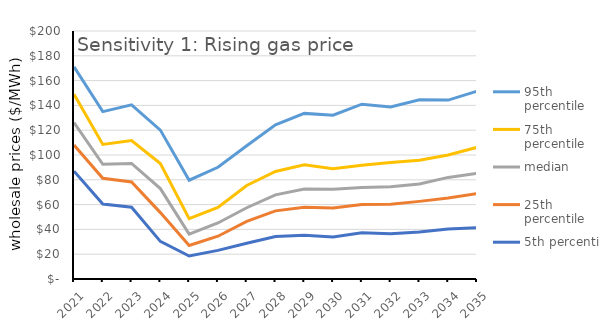
| Category | 95th percentile | 75th percentile | median | 25th percentile | 5th percentile |
|---|---|---|---|---|---|
| 2021.0 | 171.081 | 149.047 | 126.065 | 108.05 | 86.912 |
| 2022.0 | 134.95 | 108.49 | 92.52 | 81.262 | 60.397 |
| 2023.0 | 140.436 | 111.635 | 93.19 | 78.315 | 57.835 |
| 2024.0 | 120.075 | 93.102 | 72.895 | 53.545 | 30.322 |
| 2025.0 | 79.661 | 48.62 | 36.165 | 26.995 | 18.533 |
| 2026.0 | 90.066 | 57.795 | 45.18 | 34.505 | 23.068 |
| 2027.0 | 107.47 | 75.435 | 57.48 | 46.52 | 28.818 |
| 2028.0 | 124.276 | 86.675 | 67.86 | 54.933 | 34.261 |
| 2029.0 | 133.556 | 92.055 | 72.48 | 57.935 | 35.365 |
| 2030.0 | 132.094 | 88.928 | 72.295 | 57.342 | 33.807 |
| 2031.0 | 140.998 | 91.775 | 73.72 | 60.168 | 37.25 |
| 2032.0 | 138.805 | 93.902 | 74.44 | 60.25 | 36.488 |
| 2033.0 | 144.541 | 95.795 | 76.66 | 62.605 | 37.874 |
| 2034.0 | 144.282 | 100.07 | 81.94 | 65.375 | 40.374 |
| 2035.0 | 151.42 | 106.118 | 85.13 | 68.872 | 41.384 |